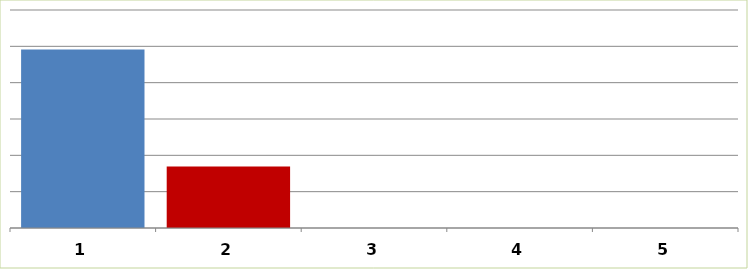
| Category | Series 0 |
|---|---|
| 0 | 24580108.86 |
| 1 | 8471749.7 |
| 2 | 0 |
| 3 | 0 |
| 4 | 0 |